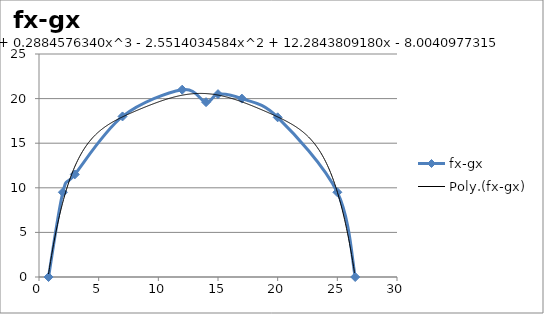
| Category | fx-gx |
|---|---|
| 0.8 | 0 |
| 2.0 | 9.5 |
| 3.0 | 11.5 |
| 7.0 | 18 |
| 12.0 | 21 |
| 14.0 | 19.6 |
| 15.0 | 20.5 |
| 17.0 | 20 |
| 20.0 | 17.9 |
| 25.0 | 9.5 |
| 26.5 | 0 |